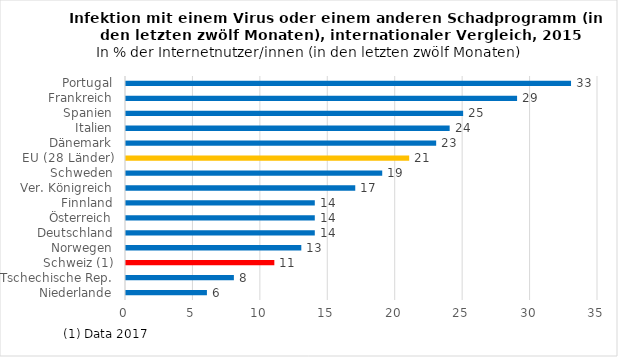
| Category | Series 0 |
|---|---|
| Niederlande | 6 |
| Tschechische Rep. | 8 |
| Schweiz (1) | 11 |
| Norwegen | 13 |
| Deutschland | 14 |
| Österreich | 14 |
| Finnland | 14 |
| Ver. Königreich | 17 |
| Schweden | 19 |
| EU (28 Länder) | 21 |
| Dänemark | 23 |
| Italien | 24 |
| Spanien | 25 |
| Frankreich | 29 |
| Portugal | 33 |